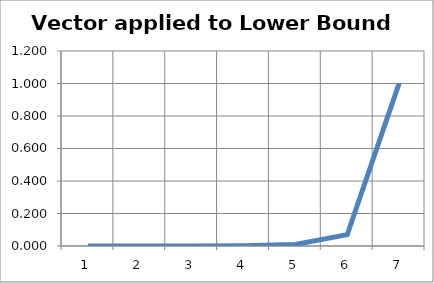
| Category | Series 0 |
|---|---|
| 0 | 0 |
| 1 | 0 |
| 2 | 0.001 |
| 3 | 0.002 |
| 4 | 0.009 |
| 5 | 0.07 |
| 6 | 1 |